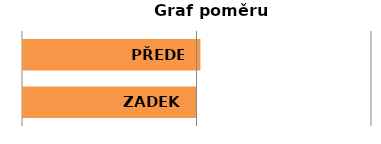
| Category | Series 0 |
|---|---|
| ZADEK | 1 |
| PŘEDEK | 1.011 |